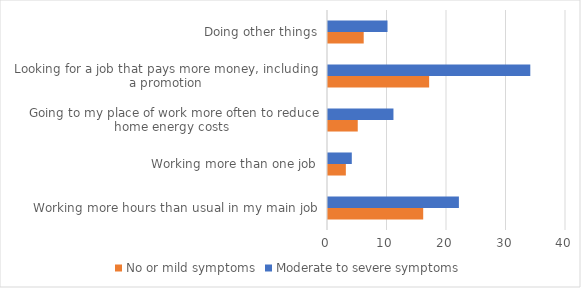
| Category | No or mild symptoms | Moderate to severe symptoms |
|---|---|---|
| Working more hours than usual in my main job | 16 | 22 |
| Working more than one job | 3 | 4 |
| Going to my place of work more often to reduce home energy costs  | 5 | 11 |
| Looking for a job that pays more money, including a promotion | 17 | 34 |
| Doing other things | 6 | 10 |